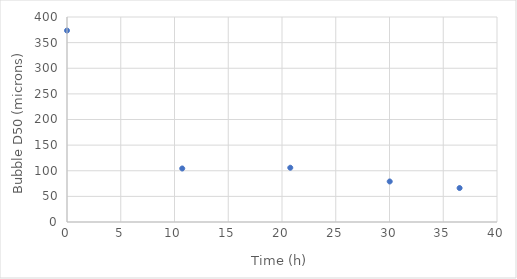
| Category | Series 0 |
|---|---|
| 0.0 | 373.56 |
| 10.72 | 104.419 |
| 20.77 | 105.869 |
| 30.02 | 79.067 |
| 36.52 | 66.276 |